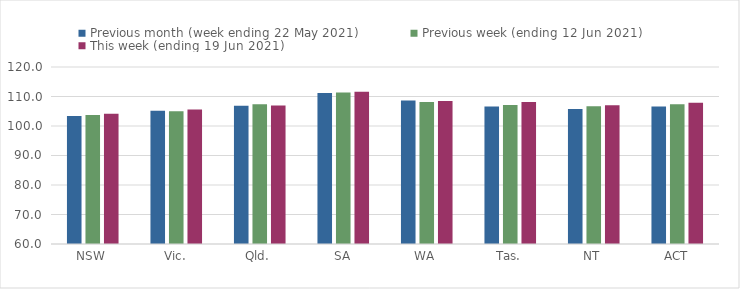
| Category | Previous month (week ending 22 May 2021) | Previous week (ending 12 Jun 2021) | This week (ending 19 Jun 2021) |
|---|---|---|---|
| NSW | 103.36 | 103.76 | 104.13 |
| Vic. | 105.15 | 105.03 | 105.63 |
| Qld. | 106.88 | 107.37 | 106.94 |
| SA | 111.17 | 111.34 | 111.57 |
| WA | 108.68 | 108.14 | 108.49 |
| Tas. | 106.61 | 107.12 | 108.11 |
| NT | 105.79 | 106.73 | 107.02 |
| ACT | 106.57 | 107.38 | 107.84 |